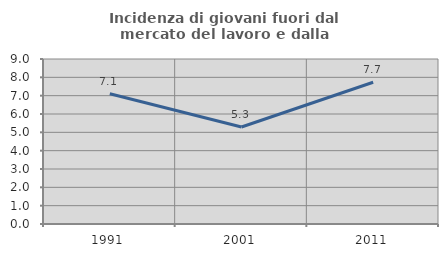
| Category | Incidenza di giovani fuori dal mercato del lavoro e dalla formazione  |
|---|---|
| 1991.0 | 7.109 |
| 2001.0 | 5.288 |
| 2011.0 | 7.733 |